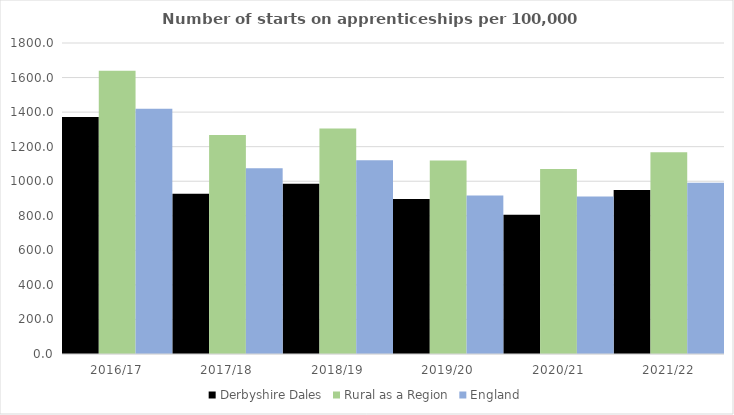
| Category | Derbyshire Dales | Rural as a Region | England |
|---|---|---|---|
| 2016/17 | 1372 | 1638.789 | 1420 |
| 2017/18 | 927 | 1267.474 | 1075 |
| 2018/19 | 985 | 1304.57 | 1122 |
| 2019/20 | 897 | 1119.662 | 918 |
| 2020/21 | 806 | 1070.748 | 912 |
| 2021/22 | 949 | 1167.68 | 991 |